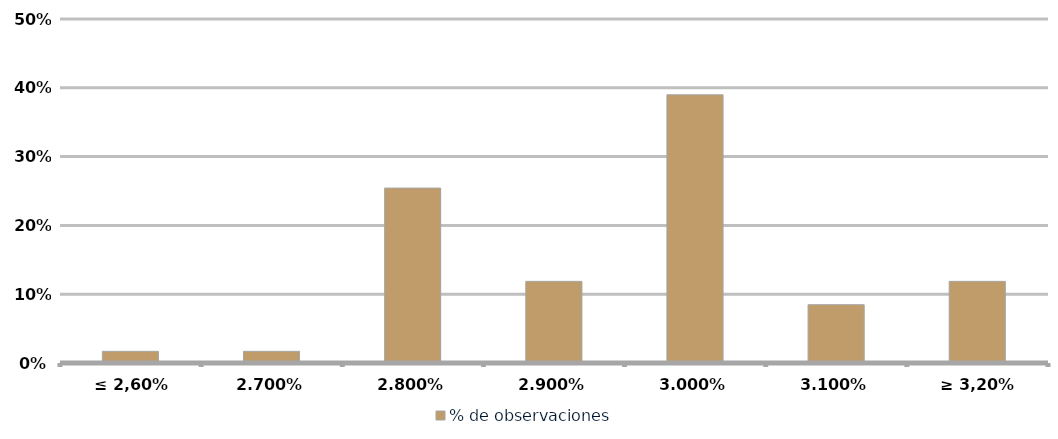
| Category | % de observaciones  |
|---|---|
| ≤ 2,60% | 0.017 |
| 2.70% | 0.017 |
| 2.80% | 0.254 |
| 2.90% | 0.119 |
| 3.00% | 0.39 |
| 3.10% | 0.085 |
| ≥ 3,20% | 0.119 |